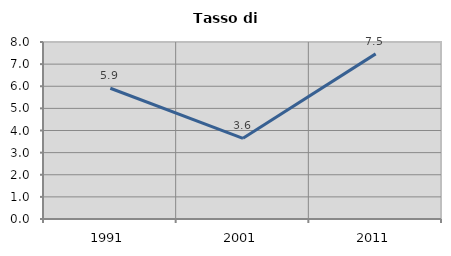
| Category | Tasso di disoccupazione   |
|---|---|
| 1991.0 | 5.909 |
| 2001.0 | 3.646 |
| 2011.0 | 7.463 |